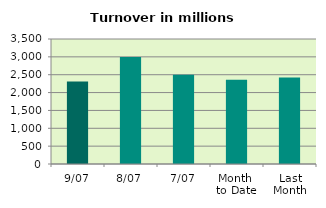
| Category | Series 0 |
|---|---|
| 9/07 | 2309.098 |
| 8/07 | 2993.438 |
| 7/07 | 2496.274 |
| Month 
to Date | 2358.111 |
| Last
Month | 2424.747 |